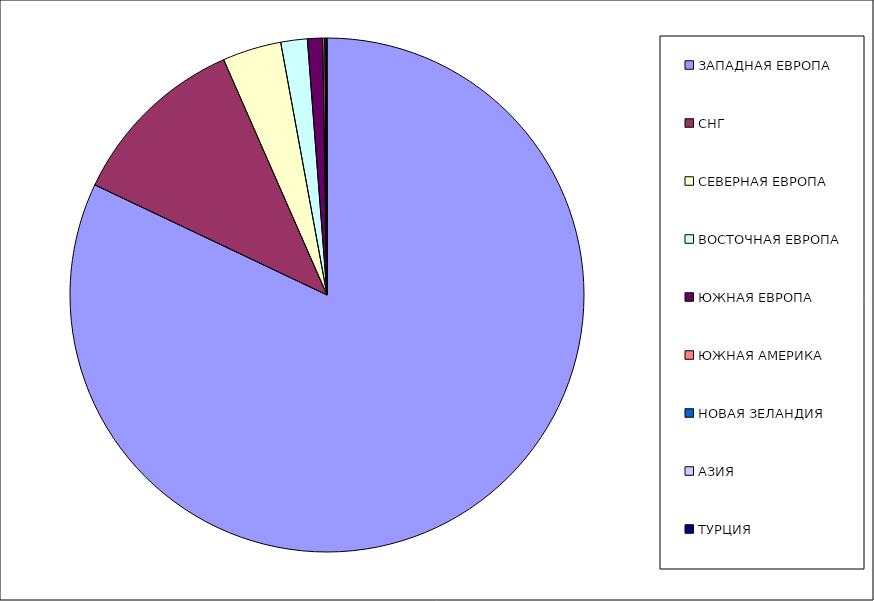
| Category | Оборот |
|---|---|
| ЗАПАДНАЯ ЕВРОПА | 0.82 |
| СНГ | 0.114 |
| СЕВЕРНАЯ ЕВРОПА | 0.037 |
| ВОСТОЧНАЯ ЕВРОПА | 0.017 |
| ЮЖНАЯ ЕВРОПА | 0.009 |
| ЮЖНАЯ АМЕРИКА | 0.001 |
| НОВАЯ ЗЕЛАНДИЯ | 0.001 |
| АЗИЯ | 0 |
| ТУРЦИЯ | 0 |